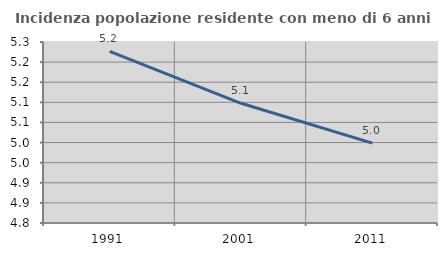
| Category | Incidenza popolazione residente con meno di 6 anni |
|---|---|
| 1991.0 | 5.227 |
| 2001.0 | 5.098 |
| 2011.0 | 4.999 |